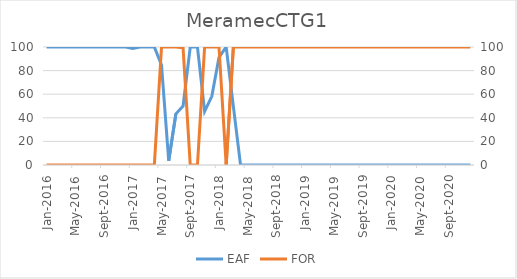
| Category | EAF |
|---|---|
| 2016-01-01 | 100 |
| 2016-02-01 | 100 |
| 2016-03-01 | 100 |
| 2016-04-01 | 100 |
| 2016-05-01 | 100 |
| 2016-06-01 | 100 |
| 2016-07-01 | 100 |
| 2016-08-01 | 100 |
| 2016-09-01 | 100 |
| 2016-10-01 | 100 |
| 2016-11-01 | 100 |
| 2016-12-01 | 100 |
| 2017-01-01 | 98.79 |
| 2017-02-01 | 100 |
| 2017-03-01 | 100 |
| 2017-04-01 | 100 |
| 2017-05-01 | 84.59 |
| 2017-06-01 | 3.61 |
| 2017-07-01 | 43.37 |
| 2017-08-01 | 50 |
| 2017-09-01 | 100 |
| 2017-10-01 | 100 |
| 2017-11-01 | 45.5 |
| 2017-12-01 | 58.2 |
| 2018-01-01 | 91.2 |
| 2018-02-01 | 100 |
| 2018-03-01 | 49.71 |
| 2018-04-01 | 0 |
| 2018-05-01 | 0 |
| 2018-06-01 | 0 |
| 2018-07-01 | 0 |
| 2018-08-01 | 0 |
| 2018-09-01 | 0 |
| 2018-10-01 | 0 |
| 2018-11-01 | 0 |
| 2018-12-01 | 0 |
| 2019-01-01 | 0 |
| 2019-02-01 | 0 |
| 2019-03-01 | 0 |
| 2019-04-01 | 0 |
| 2019-05-01 | 0 |
| 2019-06-01 | 0 |
| 2019-07-01 | 0 |
| 2019-08-01 | 0 |
| 2019-09-01 | 0 |
| 2019-10-01 | 0 |
| 2019-11-01 | 0 |
| 2019-12-01 | 0 |
| 2020-01-01 | 0 |
| 2020-02-01 | 0 |
| 2020-03-01 | 0 |
| 2020-04-01 | 0 |
| 2020-05-01 | 0 |
| 2020-06-01 | 0 |
| 2020-07-01 | 0 |
| 2020-08-01 | 0 |
| 2020-09-01 | 0 |
| 2020-10-01 | 0 |
| 2020-11-01 | 0 |
| 2020-12-01 | 0 |